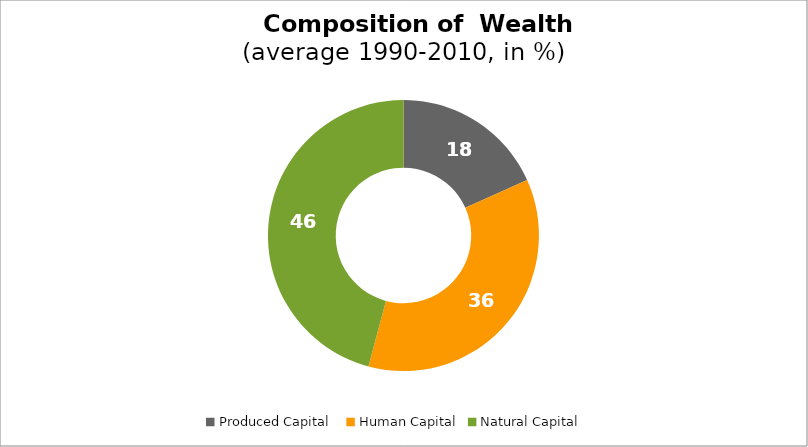
| Category | Series 0 |
|---|---|
| Produced Capital  | 18.289 |
| Human Capital | 35.881 |
| Natural Capital | 45.83 |